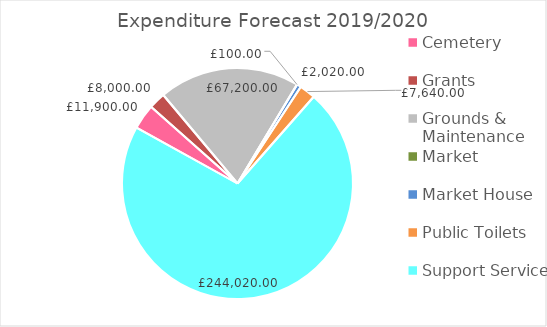
| Category | Series 0 |
|---|---|
| Cemetery | 11900 |
| Grants | 8000 |
| Grounds & Maintenance | 67200 |
| Market   | 100 |
| Market House | 2020 |
| Public Toilets | 7640 |
| Support Services | 244020 |